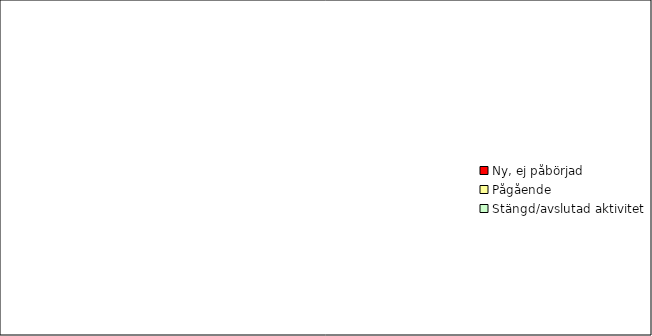
| Category | Series 1 | Series 0 |
|---|---|---|
| Ny, ej påbörjad | 0 | 0 |
| Pågående | 0 | 0 |
| Stängd/avslutad aktivitet | 0 | 0 |